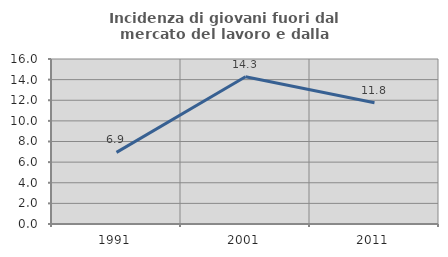
| Category | Incidenza di giovani fuori dal mercato del lavoro e dalla formazione  |
|---|---|
| 1991.0 | 6.944 |
| 2001.0 | 14.286 |
| 2011.0 | 11.765 |